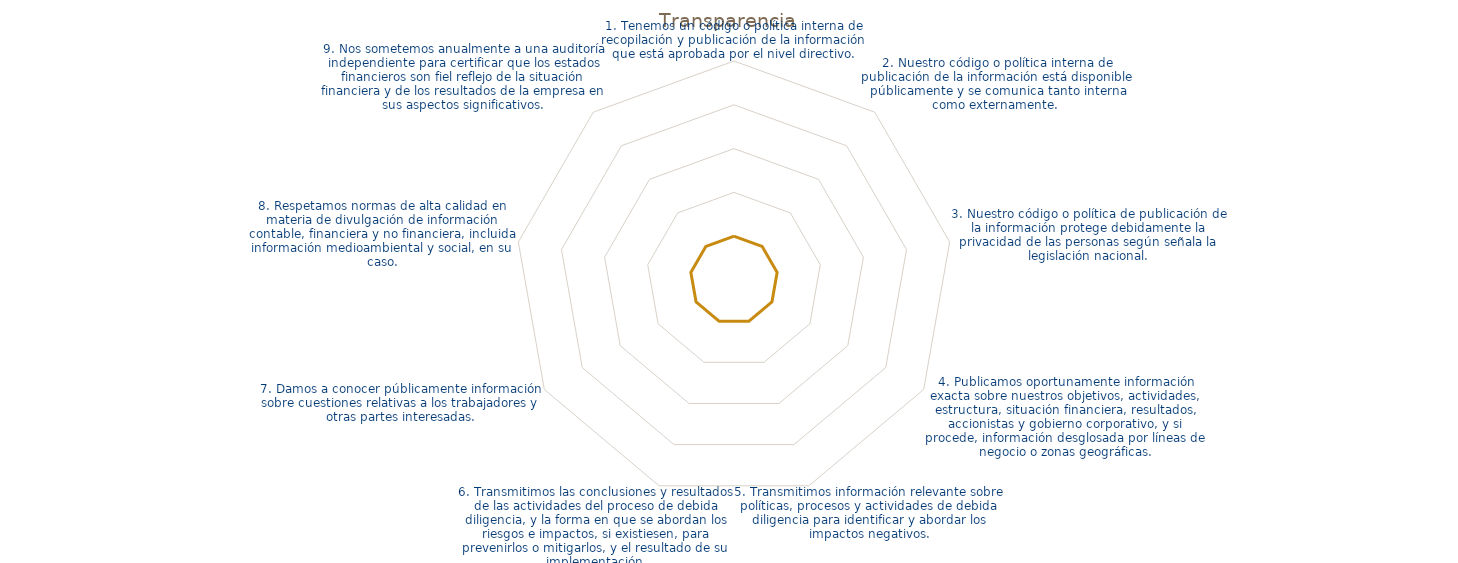
| Category | Transparencia |
|---|---|
| 1. Tenemos un código o política interna de recopilación y publicación de la información que está aprobada por el nivel directivo. | 1 |
| 2. Nuestro código o política interna de publicación de la información está disponible públicamente y se comunica tanto interna como externamente.  | 1 |
| 3. Nuestro código o política de publicación de la información protege debidamente la privacidad de las personas según señala la legislación nacional. | 1 |
| 4. Publicamos oportunamente información exacta sobre nuestros objetivos, actividades, estructura, situación financiera, resultados, accionistas y gobierno corporativo, y si procede, información desglosada por líneas de negocio o zonas geográficas. | 1 |
| 5. Transmitimos información relevante sobre políticas, procesos y actividades de debida diligencia para identificar y abordar los impactos negativos. | 1 |
| 6. Transmitimos las conclusiones y resultados de las actividades del proceso de debida diligencia, y la forma en que se abordan los riesgos e impactos, si existiesen, para prevenirlos o mitigarlos, y el resultado de su implementación. | 1 |
| 7. Damos a conocer públicamente información sobre cuestiones relativas a los trabajadores y otras partes interesadas. | 1 |
| 8. Respetamos normas de alta calidad en materia de divulgación de información contable, financiera y no financiera, incluida información medioambiental y social, en su caso. | 1 |
| 9. Nos sometemos anualmente a una auditoría independiente para certificar que los estados financieros son fiel reflejo de la situación financiera y de los resultados de la empresa en sus aspectos significativos. | 1 |